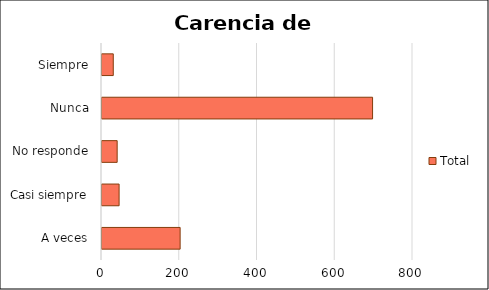
| Category | Total |
|---|---|
| A veces | 201 |
| Casi siempre | 44 |
| No responde | 39 |
| Nunca | 696 |
| Siempre | 29 |